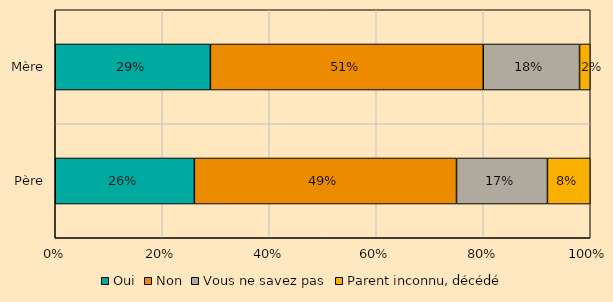
| Category | Oui | Non | Vous ne savez pas | Parent inconnu, décédé |
|---|---|---|---|---|
| Père | 0.26 | 0.49 | 0.17 | 0.08 |
| Mère | 0.29 | 0.51 | 0.18 | 0.02 |